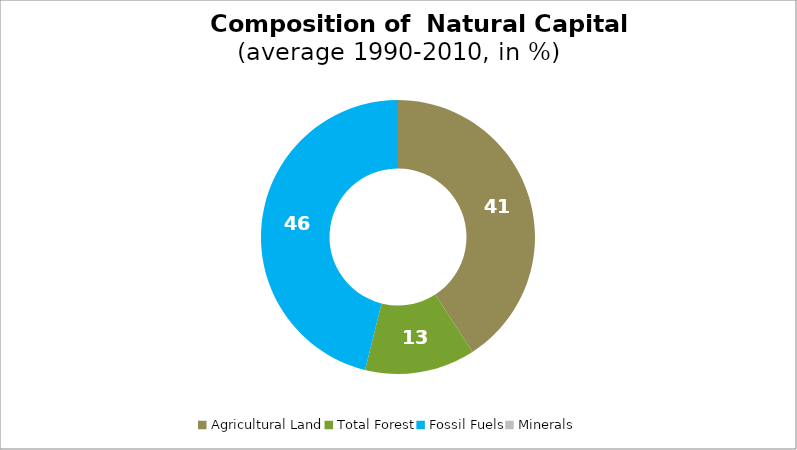
| Category | Series 0 |
|---|---|
| Agricultural Land | 40.855 |
| Total Forest | 13.009 |
| Fossil Fuels | 46.136 |
| Minerals | 0 |